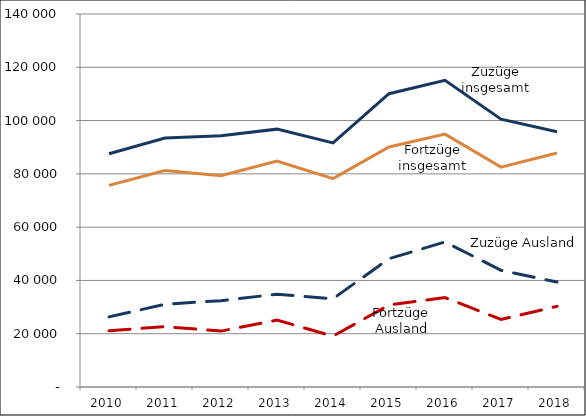
| Category | Zuzüge insgesamt | Zuzüge Ausland | Fortzüge insgesamt | Fortzüge Ausland |
|---|---|---|---|---|
| 2010.0 | 87538 | 26324 | 75668 | 21078 |
| 2011.0 | 93466 | 31048 | 81231 | 22674 |
| 2012.0 | 94346 | 32412 | 79335 | 20979 |
| 2013.0 | 96782 | 34839 | 84823 | 25125 |
| 2014.0 | 91594 | 33131 | 78218 | 19091 |
| 2015.0 | 110070 | 48173 | 90072 | 30757 |
| 2016.0 | 115115 | 54438 | 94914 | 33587 |
| 2017.0 | 100534 | 43809 | 82525 | 25341 |
| 2018.0 | 95790 | 39392 | 87811 | 30263 |